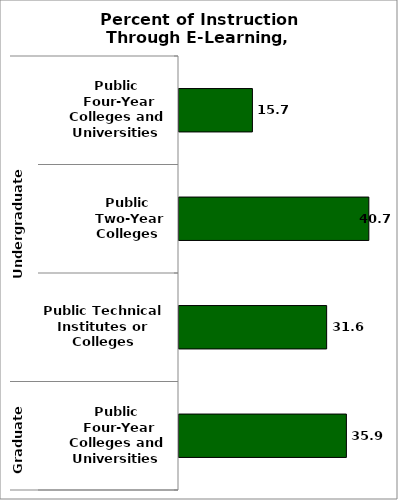
| Category | State |
|---|---|
| 0 | 15.731 |
| 1 | 40.679 |
| 2 | 31.638 |
| 3 | 35.872 |